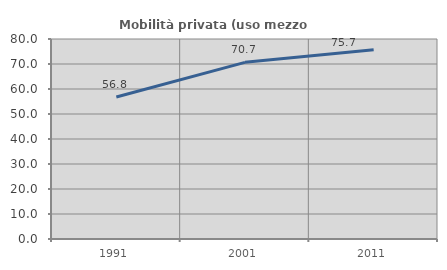
| Category | Mobilità privata (uso mezzo privato) |
|---|---|
| 1991.0 | 56.814 |
| 2001.0 | 70.658 |
| 2011.0 | 75.659 |